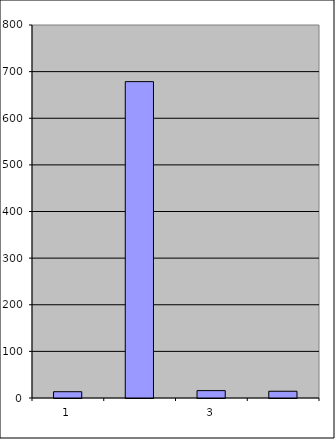
| Category | Series 0 |
|---|---|
| 0 | 13.5 |
| 1 | 678.534 |
| 2 | 15.842 |
| 3 | 14.504 |